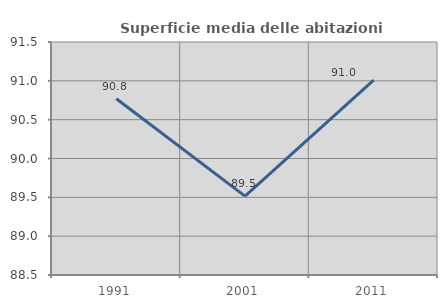
| Category | Superficie media delle abitazioni occupate |
|---|---|
| 1991.0 | 90.77 |
| 2001.0 | 89.515 |
| 2011.0 | 91.01 |